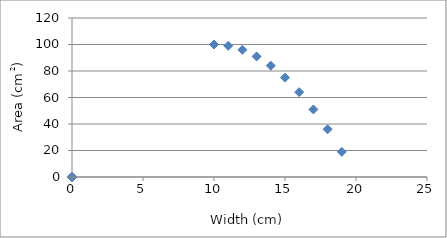
| Category | Series 0 |
|---|---|
| 10.0 | 100 |
| 11.0 | 99 |
| 12.0 | 96 |
| 13.0 | 91 |
| 14.0 | 84 |
| 15.0 | 75 |
| 16.0 | 64 |
| 17.0 | 51 |
| 18.0 | 36 |
| 19.0 | 19 |
| 0.0 | 0 |
| 0.0 | 0 |
| 0.0 | 0 |
| 0.0 | 0 |
| 0.0 | 0 |
| 0.0 | 0 |
| 0.0 | 0 |
| 0.0 | 0 |
| 0.0 | 0 |
| 0.0 | 0 |
| 0.0 | 0 |
| 0.0 | 0 |
| 0.0 | 0 |
| 0.0 | 0 |